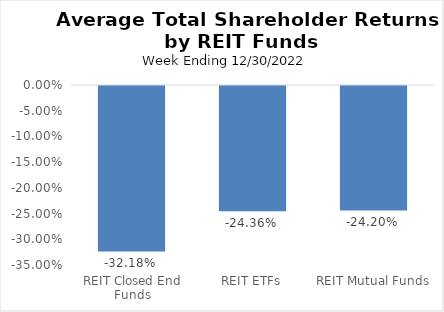
| Category | Average TSR |
|---|---|
| REIT Closed End Funds | -0.322 |
| REIT ETFs | -0.244 |
| REIT Mutual Funds | -0.242 |